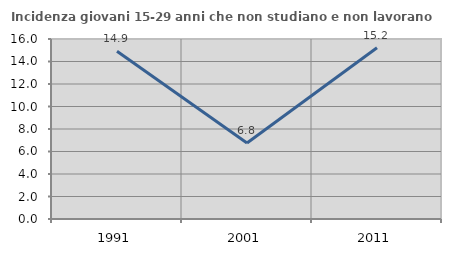
| Category | Incidenza giovani 15-29 anni che non studiano e non lavorano  |
|---|---|
| 1991.0 | 14.912 |
| 2001.0 | 6.762 |
| 2011.0 | 15.217 |